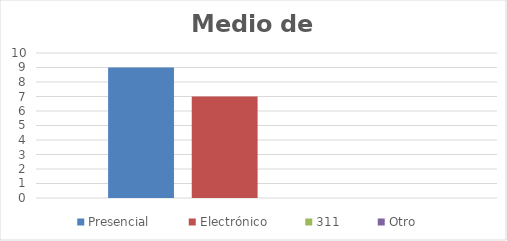
| Category | Presencial | Electrónico | 311 | Otro |
|---|---|---|---|---|
| 0 | 9 | 7 | 0 | 0 |